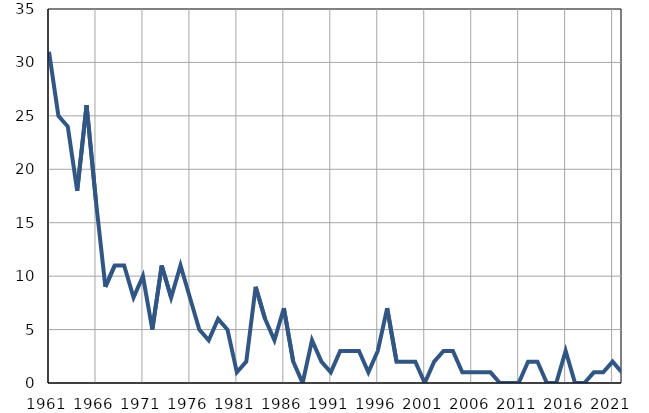
| Category | Умрла 
одојчад |
|---|---|
| 1961.0 | 31 |
| 1962.0 | 25 |
| 1963.0 | 24 |
| 1964.0 | 18 |
| 1965.0 | 26 |
| 1966.0 | 17 |
| 1967.0 | 9 |
| 1968.0 | 11 |
| 1969.0 | 11 |
| 1970.0 | 8 |
| 1971.0 | 10 |
| 1972.0 | 5 |
| 1973.0 | 11 |
| 1974.0 | 8 |
| 1975.0 | 11 |
| 1976.0 | 8 |
| 1977.0 | 5 |
| 1978.0 | 4 |
| 1979.0 | 6 |
| 1980.0 | 5 |
| 1981.0 | 1 |
| 1982.0 | 2 |
| 1983.0 | 9 |
| 1984.0 | 6 |
| 1985.0 | 4 |
| 1986.0 | 7 |
| 1987.0 | 2 |
| 1988.0 | 0 |
| 1989.0 | 4 |
| 1990.0 | 2 |
| 1991.0 | 1 |
| 1992.0 | 3 |
| 1993.0 | 3 |
| 1994.0 | 3 |
| 1995.0 | 1 |
| 1996.0 | 3 |
| 1997.0 | 7 |
| 1998.0 | 2 |
| 1999.0 | 2 |
| 2000.0 | 2 |
| 2001.0 | 0 |
| 2002.0 | 2 |
| 2003.0 | 3 |
| 2004.0 | 3 |
| 2005.0 | 1 |
| 2006.0 | 1 |
| 2007.0 | 1 |
| 2008.0 | 1 |
| 2009.0 | 0 |
| 2010.0 | 0 |
| 2011.0 | 0 |
| 2012.0 | 2 |
| 2013.0 | 2 |
| 2014.0 | 0 |
| 2015.0 | 0 |
| 2016.0 | 3 |
| 2017.0 | 0 |
| 2018.0 | 0 |
| 2019.0 | 1 |
| 2020.0 | 1 |
| 2021.0 | 2 |
| 2022.0 | 1 |